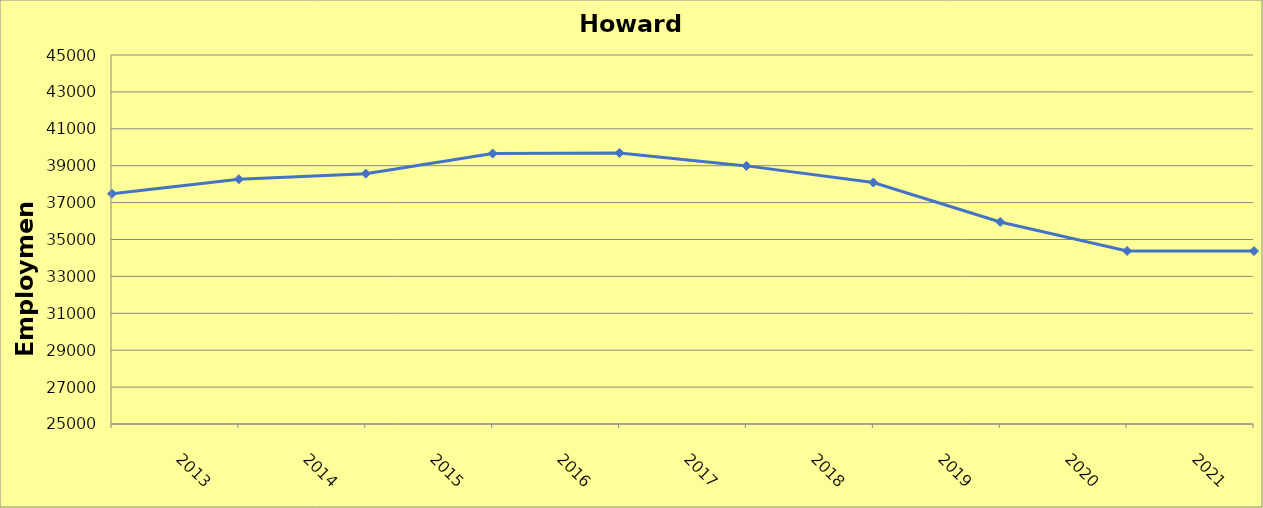
| Category | Howard County |
|---|---|
| 2013.0 | 37480 |
| 2014.0 | 38270 |
| 2015.0 | 38570 |
| 2016.0 | 39660 |
| 2017.0 | 39690 |
| 2018.0 | 38990 |
| 2019.0 | 38090 |
| 2020.0 | 35950 |
| 2021.0 | 34380 |
| 2022.0 | 34376 |